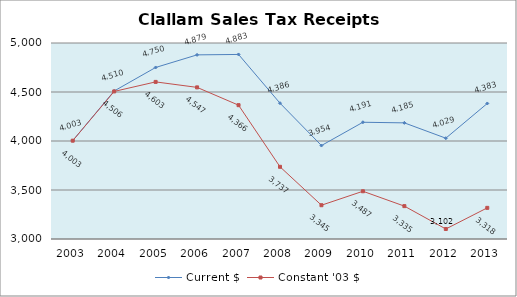
| Category | Current $ | Constant '03 $ |
|---|---|---|
| 2003.0 | 4003.396 | 4003.396 |
| 2004.0 | 4510.296 | 4505.786 |
| 2005.0 | 4750.3 | 4603.041 |
| 2006.0 | 4878.887 | 4547.123 |
| 2007.0 | 4883.221 | 4365.6 |
| 2008.0 | 4385.707 | 3736.622 |
| 2009.0 | 3953.657 | 3344.794 |
| 2010.0 | 4191.304 | 3487.165 |
| 2011.0 | 4185.06 | 3335.493 |
| 2012.0 | 4028.689 | 3102.091 |
| 2013.0 | 4382.822 | 3317.796 |